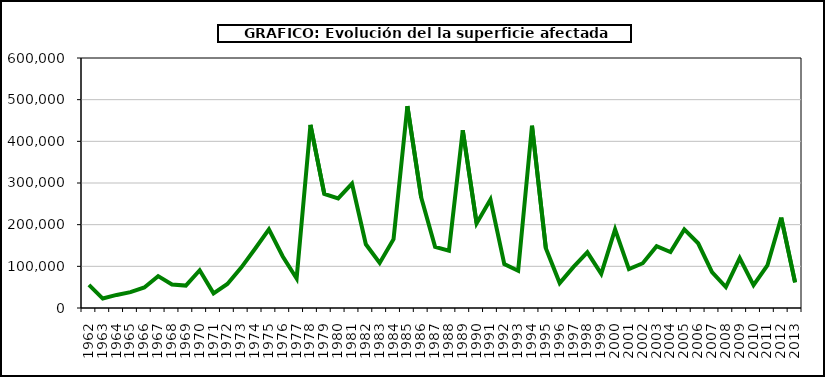
| Category | Series 0 |
|---|---|
| 1962.0 | 55482 |
| 1963.0 | 22679 |
| 1964.0 | 31398 |
| 1965.0 | 38018 |
| 1966.0 | 49354 |
| 1967.0 | 76575 |
| 1968.0 | 56497 |
| 1969.0 | 53739 |
| 1970.0 | 90547 |
| 1971.0 | 35044 |
| 1972.0 | 57753 |
| 1973.0 | 96989 |
| 1974.0 | 142115 |
| 1975.0 | 188595 |
| 1976.0 | 123577 |
| 1977.0 | 70749 |
| 1978.0 | 439526 |
| 1979.0 | 273567 |
| 1980.0 | 263017 |
| 1981.0 | 298288 |
| 1982.0 | 152903 |
| 1983.0 | 108100 |
| 1984.0 | 165119 |
| 1985.0 | 484476 |
| 1986.0 | 264887 |
| 1987.0 | 146662 |
| 1988.0 | 137734 |
| 1989.0 | 426693 |
| 1990.0 | 203032 |
| 1991.0 | 260318 |
| 1992.0 | 105277 |
| 1993.0 | 89267 |
| 1994.0 | 437635 |
| 1995.0 | 143484 |
| 1996.0 | 59814 |
| 1997.0 | 98503 |
| 1998.0 | 133643 |
| 1999.0 | 82217 |
| 2000.0 | 188586 |
| 2001.0 | 93297 |
| 2002.0 | 107464 |
| 2003.0 | 148172 |
| 2004.0 | 134193 |
| 2005.0 | 188672 |
| 2006.0 | 155363 |
| 2007.0 | 86113 |
| 2008.0 | 50321 |
| 2009.0 | 119892 |
| 2010.0 | 54770 |
| 2011.0 | 102162 |
| 2012.0 | 216894 |
| 2013.0 | 61690.61 |